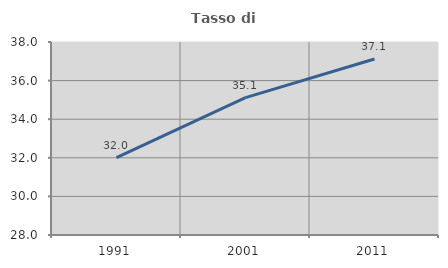
| Category | Tasso di occupazione   |
|---|---|
| 1991.0 | 32.013 |
| 2001.0 | 35.117 |
| 2011.0 | 37.122 |